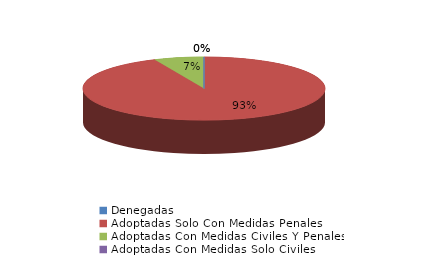
| Category | Series 0 |
|---|---|
| Denegadas | 0 |
| Adoptadas Solo Con Medidas Penales | 14 |
| Adoptadas Con Medidas Civiles Y Penales | 1 |
| Adoptadas Con Medidas Solo Civiles | 0 |